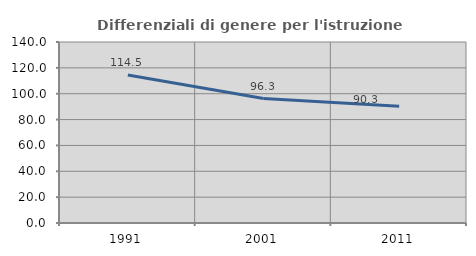
| Category | Differenziali di genere per l'istruzione superiore |
|---|---|
| 1991.0 | 114.512 |
| 2001.0 | 96.268 |
| 2011.0 | 90.261 |